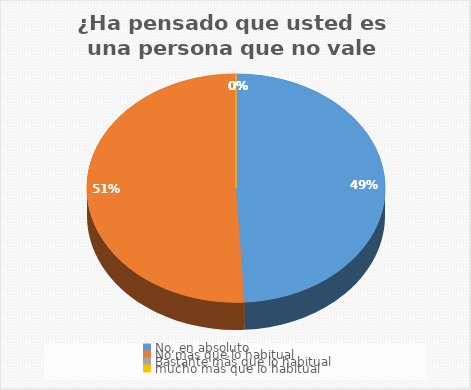
| Category | ¿Ha pensado que usted es una persona que no vale para nada? |
|---|---|
| No, en absoluto  | 54 |
| No mas que lo habitual | 56 |
| Bastante más que lo habitual | 0 |
| mucho más que lo habitual | 0 |